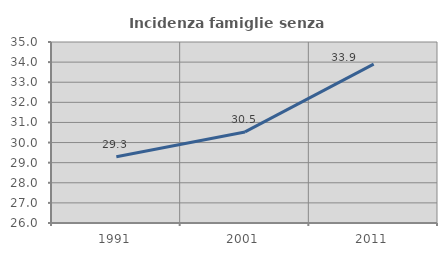
| Category | Incidenza famiglie senza nuclei |
|---|---|
| 1991.0 | 29.293 |
| 2001.0 | 30.527 |
| 2011.0 | 33.898 |